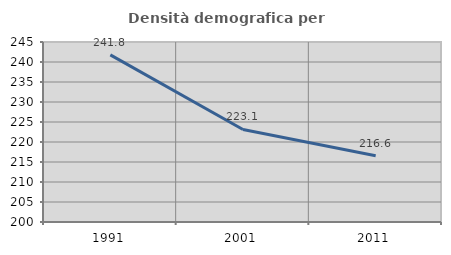
| Category | Densità demografica |
|---|---|
| 1991.0 | 241.781 |
| 2001.0 | 223.14 |
| 2011.0 | 216.561 |